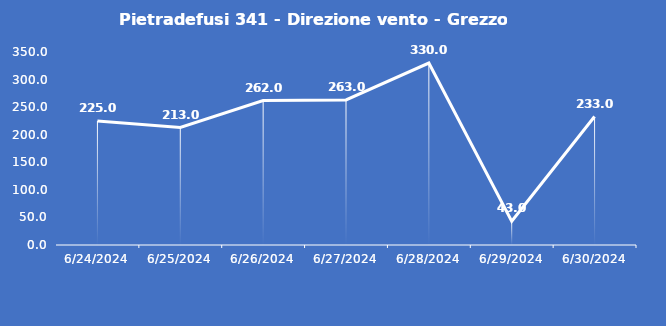
| Category | Pietradefusi 341 - Direzione vento - Grezzo (°N) |
|---|---|
| 6/24/24 | 225 |
| 6/25/24 | 213 |
| 6/26/24 | 262 |
| 6/27/24 | 263 |
| 6/28/24 | 330 |
| 6/29/24 | 43 |
| 6/30/24 | 233 |